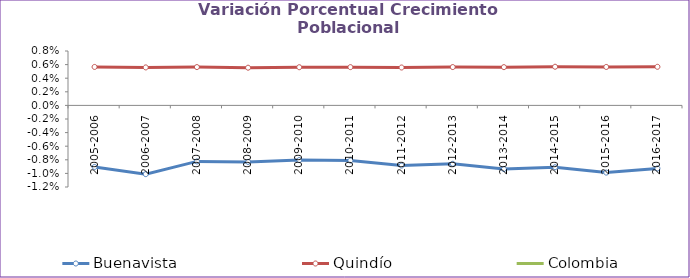
| Category | Buenavista | Quindío | Colombia |
|---|---|---|---|
| 2005-2006 | -0.009 | 0.006 | 0 |
| 2006-2007 | -0.01 | 0.006 | 0 |
| 2007-2008 | -0.008 | 0.006 | 0 |
| 2008-2009 | -0.008 | 0.006 | 0 |
| 2009-2010 | -0.008 | 0.006 | 0 |
| 2010-2011 | -0.008 | 0.006 | 0 |
| 2011-2012 | -0.009 | 0.006 | 0 |
| 2012-2013 | -0.009 | 0.006 | 0 |
| 2013-2014 | -0.009 | 0.006 | 0 |
| 2014-2015 | -0.009 | 0.006 | 0 |
| 2015-2016 | -0.01 | 0.006 | 0 |
| 2016-2017 | -0.009 | 0.006 | 0 |